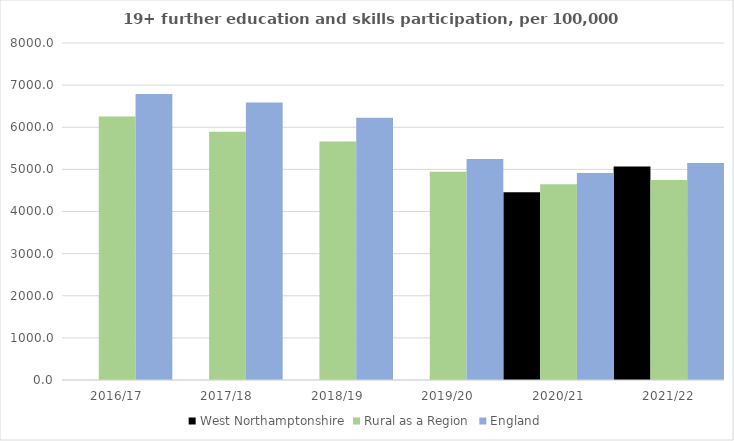
| Category | West Northamptonshire | Rural as a Region | England |
|---|---|---|---|
| 2016/17 | 0 | 6253.401 | 6788 |
| 2017/18 | 0 | 5892.029 | 6588 |
| 2018/19 | 0 | 5661.873 | 6227 |
| 2019/20 | 0 | 4943.801 | 5244 |
| 2020/21 | 4456 | 4646.727 | 4913 |
| 2021/22 | 5066 | 4747.049 | 5151 |